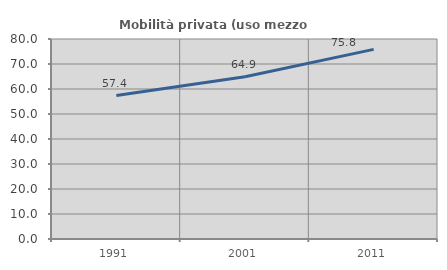
| Category | Mobilità privata (uso mezzo privato) |
|---|---|
| 1991.0 | 57.397 |
| 2001.0 | 64.931 |
| 2011.0 | 75.847 |